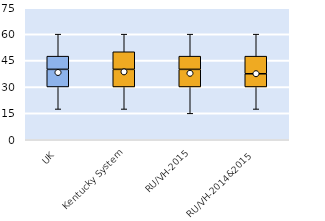
| Category | 25th | 50th | 75th |
|---|---|---|---|
| UK | 30 | 10 | 7.5 |
| Kentucky System | 30 | 10 | 10 |
| RU/VH-2015 | 30 | 10 | 7.5 |
| RU/VH-2014&2015 | 30 | 7.5 | 10 |